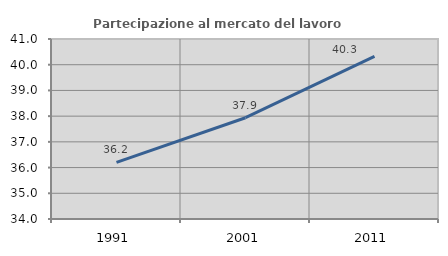
| Category | Partecipazione al mercato del lavoro  femminile |
|---|---|
| 1991.0 | 36.199 |
| 2001.0 | 37.939 |
| 2011.0 | 40.323 |